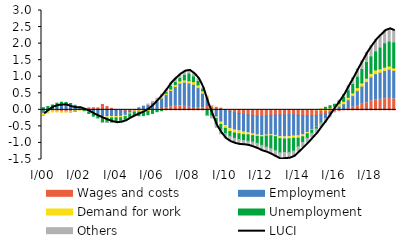
| Category | Wages and costs | Employment | Demand for work | Unemployment | Others |
|---|---|---|---|---|---|
| I/00 | -0.017 | -0.091 | -0.065 | 0.066 | -0.016 |
| II | -0.021 | -0.03 | -0.048 | 0.099 | -0.005 |
| III | -0.028 | 0.031 | -0.035 | 0.115 | 0.001 |
| IV | -0.037 | 0.092 | -0.029 | 0.11 | -0.005 |
| I/01 | -0.046 | 0.15 | -0.025 | 0.081 | -0.014 |
| II | -0.049 | 0.188 | -0.023 | 0.037 | -0.008 |
| III | -0.045 | 0.177 | -0.022 | 0.014 | -0.031 |
| IV | -0.022 | 0.139 | -0.016 | -0.007 | -0.029 |
| I/02 | 0.016 | 0.057 | -0.008 | 0.008 | -0.013 |
| II | 0.043 | -0.012 | -0.007 | -0.009 | -0.002 |
| III | 0.059 | -0.069 | -0.009 | -0.034 | 0.005 |
| IV | 0.063 | -0.11 | -0.016 | -0.065 | 0.006 |
| I/03 | 0.058 | -0.139 | -0.023 | -0.083 | -0.001 |
| II | 0.163 | -0.212 | -0.046 | -0.122 | -0.034 |
| III | 0.099 | -0.212 | -0.04 | -0.124 | -0.03 |
| IV | 0.045 | -0.21 | -0.036 | -0.128 | -0.026 |
| I/04 | 0.003 | -0.203 | -0.038 | -0.116 | -0.034 |
| II | -0.025 | -0.174 | -0.041 | -0.098 | -0.035 |
| III | -0.039 | -0.129 | -0.037 | -0.094 | -0.03 |
| IV | -0.039 | -0.065 | -0.025 | -0.096 | -0.023 |
| I/05 | -0.034 | 0.008 | -0.032 | -0.105 | -0.015 |
| II | -0.031 | 0.061 | -0.035 | -0.112 | 0.001 |
| III | -0.026 | 0.103 | -0.038 | -0.111 | 0.016 |
| IV | -0.016 | 0.141 | -0.032 | -0.101 | 0.036 |
| I/06 | 0.002 | 0.189 | -0.011 | -0.098 | 0.063 |
| II | 0.017 | 0.242 | 0.007 | -0.056 | 0.082 |
| III | 0.04 | 0.314 | 0.022 | -0.026 | 0.096 |
| IV | 0.065 | 0.4 | 0.034 | 0.022 | 0.105 |
| I/07 | 0.088 | 0.495 | 0.045 | 0.079 | 0.114 |
| II | 0.108 | 0.596 | 0.059 | 0.072 | 0.124 |
| III | 0.118 | 0.687 | 0.068 | 0.084 | 0.124 |
| IV | 0.104 | 0.732 | 0.068 | 0.149 | 0.116 |
| I/08 | 0.078 | 0.731 | 0.068 | 0.21 | 0.104 |
| II | 0.069 | 0.705 | 0.078 | 0.149 | 0.092 |
| III | 0.061 | 0.608 | 0.083 | 0.114 | 0.072 |
| IV | 0.061 | 0.439 | 0.076 | 0.058 | 0.025 |
| I/09 | 0.1 | 0.26 | 0.062 | -0.17 | -0.031 |
| II | 0.104 | 0.018 | 0.013 | -0.185 | -0.092 |
| III | 0.076 | -0.222 | -0.041 | -0.162 | -0.133 |
| IV | 0.051 | -0.374 | -0.068 | -0.16 | -0.151 |
| I/10 | 0.01 | -0.478 | -0.079 | -0.161 | -0.163 |
| II | -0.043 | -0.527 | -0.085 | -0.144 | -0.163 |
| III | -0.082 | -0.533 | -0.084 | -0.16 | -0.155 |
| IV | -0.108 | -0.532 | -0.084 | -0.172 | -0.151 |
| I/11 | -0.132 | -0.543 | -0.075 | -0.176 | -0.129 |
| II | -0.154 | -0.545 | -0.057 | -0.194 | -0.127 |
| III | -0.175 | -0.558 | -0.047 | -0.194 | -0.148 |
| IV | -0.189 | -0.574 | -0.039 | -0.209 | -0.163 |
| I/12 | -0.197 | -0.585 | -0.033 | -0.26 | -0.167 |
| II | -0.187 | -0.579 | -0.026 | -0.333 | -0.159 |
| III | -0.172 | -0.585 | -0.028 | -0.391 | -0.171 |
| IV | -0.159 | -0.615 | -0.037 | -0.423 | -0.187 |
| I/13 | -0.157 | -0.659 | -0.054 | -0.427 | -0.193 |
| II | -0.151 | -0.671 | -0.058 | -0.409 | -0.183 |
| III | -0.147 | -0.668 | -0.06 | -0.417 | -0.168 |
| IV | -0.148 | -0.649 | -0.061 | -0.389 | -0.154 |
| I/14 | -0.165 | -0.627 | -0.064 | -0.259 | -0.158 |
| II | -0.179 | -0.579 | -0.056 | -0.171 | -0.154 |
| III | -0.185 | -0.506 | -0.035 | -0.134 | -0.145 |
| IV | -0.183 | -0.425 | -0.01 | -0.094 | -0.137 |
| I/15 | -0.177 | -0.345 | 0.011 | -0.056 | -0.136 |
| II | -0.153 | -0.242 | 0.032 | -0.012 | -0.132 |
| III | -0.126 | -0.153 | 0.047 | 0.029 | -0.124 |
| IV | -0.089 | -0.061 | 0.061 | 0.063 | -0.096 |
| I/16 | -0.049 | 0.033 | 0.07 | 0.066 | -0.043 |
| II | -0.018 | 0.111 | 0.073 | 0.082 | 0.023 |
| III | 0.008 | 0.176 | 0.072 | 0.132 | 0.089 |
| IV | 0.042 | 0.262 | 0.076 | 0.2 | 0.153 |
| I/17 | 0.08 | 0.349 | 0.081 | 0.265 | 0.199 |
| II | 0.128 | 0.452 | 0.092 | 0.325 | 0.238 |
| III | 0.168 | 0.546 | 0.097 | 0.407 | 0.263 |
| IV | 0.214 | 0.639 | 0.103 | 0.483 | 0.29 |
| I/18 | 0.264 | 0.728 | 0.109 | 0.504 | 0.328 |
| II | 0.303 | 0.79 | 0.112 | 0.552 | 0.366 |
| III | 0.319 | 0.815 | 0.104 | 0.636 | 0.385 |
| IV | 0.334 | 0.852 | 0.101 | 0.712 | 0.396 |
| I/19 | 0.344 | 0.881 | 0.098 | 0.733 | 0.39 |
| II | 0.327 | 0.861 | 0.08 | 0.761 | 0.361 |